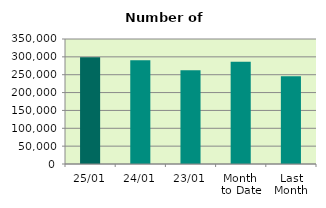
| Category | Series 0 |
|---|---|
| 25/01 | 298992 |
| 24/01 | 290326 |
| 23/01 | 262340 |
| Month 
to Date | 286063.333 |
| Last
Month | 245553.619 |